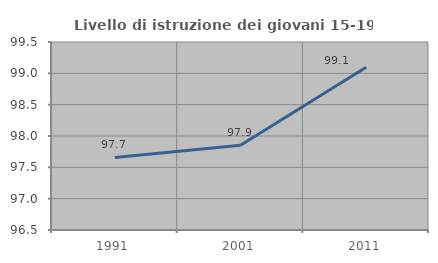
| Category | Livello di istruzione dei giovani 15-19 anni |
|---|---|
| 1991.0 | 97.659 |
| 2001.0 | 97.851 |
| 2011.0 | 99.097 |